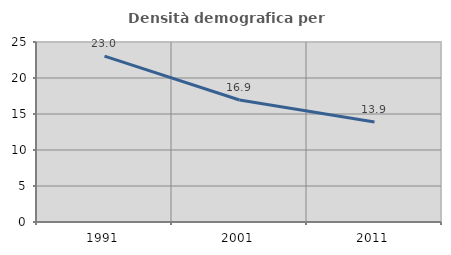
| Category | Densità demografica |
|---|---|
| 1991.0 | 23.037 |
| 2001.0 | 16.939 |
| 2011.0 | 13.89 |